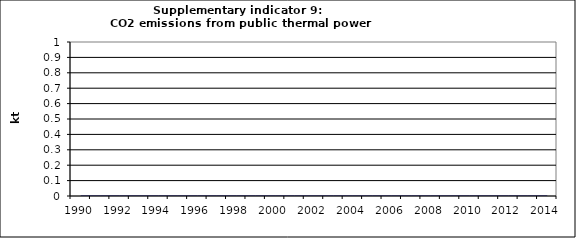
| Category | CO2 emissions from public thermal power stations, kt |
|---|---|
| 1990 | 0 |
| 1991 | 0 |
| 1992 | 0 |
| 1993 | 0 |
| 1994 | 0 |
| 1995 | 0 |
| 1996 | 0 |
| 1997 | 0 |
| 1998 | 0 |
| 1999 | 0 |
| 2000 | 0 |
| 2001 | 0 |
| 2002 | 0 |
| 2003 | 0 |
| 2004 | 0 |
| 2005 | 0 |
| 2006 | 0 |
| 2007 | 0 |
| 2008 | 0 |
| 2009 | 0 |
| 2010 | 0 |
| 2011 | 0 |
| 2012 | 0 |
| 2013 | 0 |
| 2014 | 0 |